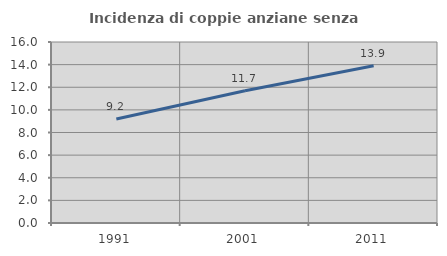
| Category | Incidenza di coppie anziane senza figli  |
|---|---|
| 1991.0 | 9.199 |
| 2001.0 | 11.689 |
| 2011.0 | 13.905 |